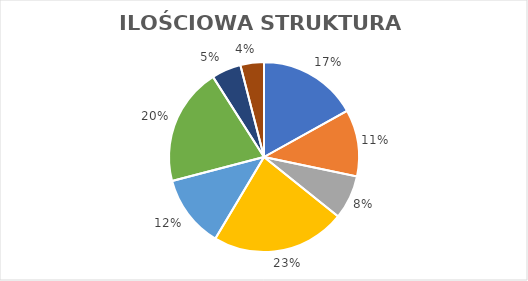
| Category | Series 0 |
|---|---|
| 0 | 0.169 |
| 1 | 0.114 |
| 2 | 0.075 |
| 3 | 0.228 |
| 4 | 0.124 |
| 5 | 0.201 |
| 6 | 0.05 |
| 7 | 0.04 |